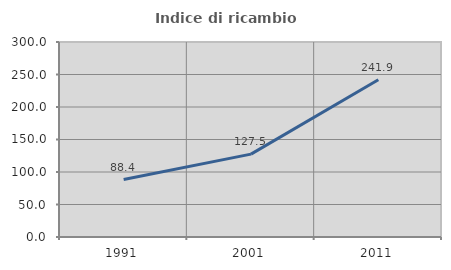
| Category | Indice di ricambio occupazionale  |
|---|---|
| 1991.0 | 88.413 |
| 2001.0 | 127.476 |
| 2011.0 | 241.901 |